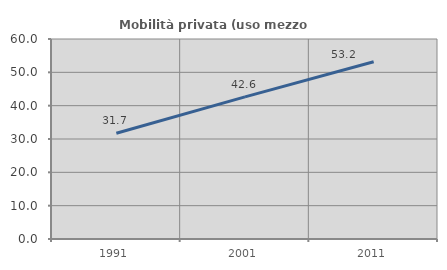
| Category | Mobilità privata (uso mezzo privato) |
|---|---|
| 1991.0 | 31.731 |
| 2001.0 | 42.627 |
| 2011.0 | 53.167 |